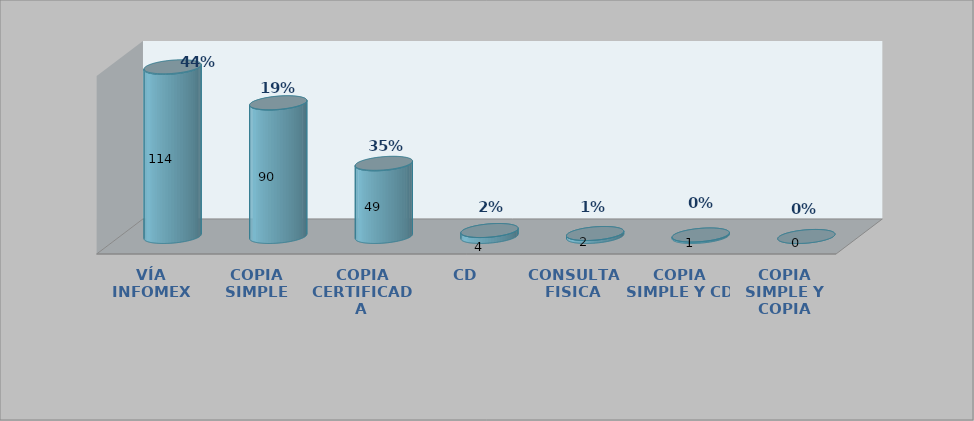
| Category | Series 0 | Series 1 | Series 2 | Series 3 |
|---|---|---|---|---|
| VÍA INFOMEX |  |  | 114 | 0.438 |
| COPIA SIMPLE |  |  | 90 | 0.188 |
| COPIA CERTIFICADA |  |  | 49 | 0.346 |
| CD |  |  | 4 | 0.015 |
| CONSULTA FISICA |  |  | 2 | 0.008 |
| COPIA SIMPLE Y CD |  |  | 1 | 0.004 |
| COPIA SIMPLE Y COPIA CERTIFICADA |  |  | 0 | 0 |